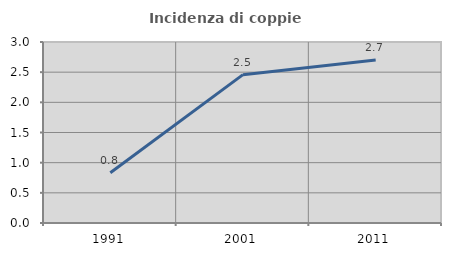
| Category | Incidenza di coppie miste |
|---|---|
| 1991.0 | 0.833 |
| 2001.0 | 2.459 |
| 2011.0 | 2.703 |